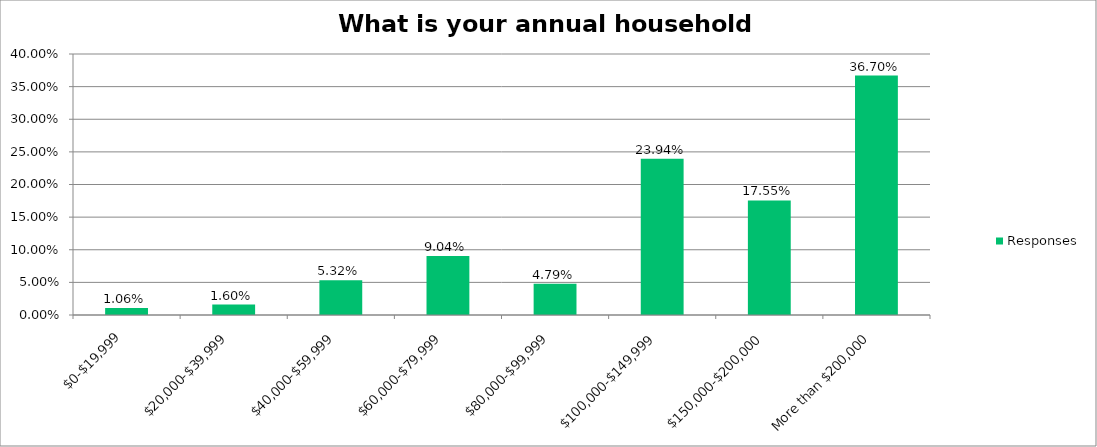
| Category | Responses |
|---|---|
| $0-$19,999 | 0.011 |
| $20,000-$39,999 | 0.016 |
| $40,000-$59,999 | 0.053 |
| $60,000-$79,999 | 0.09 |
| $80,000-$99,999 | 0.048 |
| $100,000-$149,999 | 0.239 |
| $150,000-$200,000 | 0.176 |
| More than $200,000 | 0.367 |